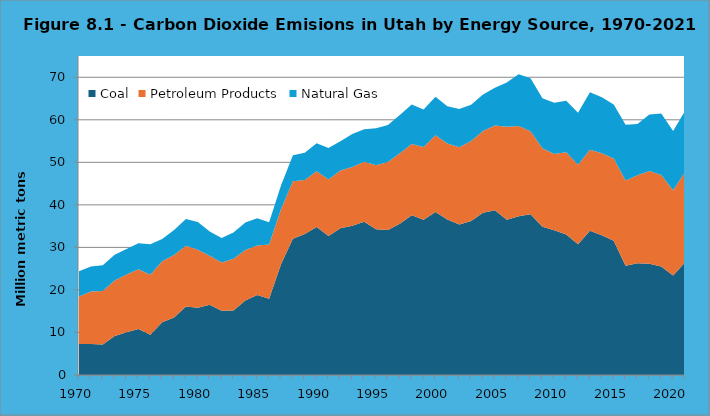
| Category | Coal | Petroleum Products | Natural Gas |
|---|---|---|---|
| 1970.0 | 7.272 | 11.194 | 5.926 |
| 1971.0 | 7.285 | 12.32 | 5.906 |
| 1972.0 | 7.187 | 12.558 | 6.034 |
| 1973.0 | 9.188 | 13.02 | 6.036 |
| 1974.0 | 10.025 | 13.615 | 5.974 |
| 1975.0 | 10.792 | 14.077 | 6.132 |
| 1976.0 | 9.465 | 14.086 | 7.212 |
| 1977.0 | 12.417 | 14.321 | 5.232 |
| 1978.0 | 13.503 | 14.714 | 5.888 |
| 1979.0 | 16.087 | 14.314 | 6.283 |
| 1980.0 | 15.835 | 13.617 | 6.497 |
| 1981.0 | 16.543 | 11.505 | 5.708 |
| 1982.0 | 15.078 | 11.381 | 5.76 |
| 1983.0 | 15.147 | 12.191 | 6.168 |
| 1984.0 | 17.509 | 11.868 | 6.46 |
| 1985.0 | 18.824 | 11.608 | 6.445 |
| 1986.0 | 17.907 | 12.788 | 5.195 |
| 1987.0 | 26.038 | 12.934 | 5.564 |
| 1988.0 | 32.056 | 13.474 | 6.125 |
| 1989.0 | 33.172 | 12.677 | 6.416 |
| 1990.0 | 34.795 | 13.089 | 6.589 |
| 1991.0 | 32.699 | 13.281 | 7.406 |
| 1992.0 | 34.487 | 13.602 | 6.878 |
| 1993.0 | 35.116 | 13.793 | 7.775 |
| 1994.0 | 36.051 | 14.08 | 7.639 |
| 1995.0 | 34.255 | 15.064 | 8.681 |
| 1996.0 | 34.114 | 15.941 | 8.748 |
| 1997.0 | 35.541 | 16.622 | 8.972 |
| 1998.0 | 37.573 | 16.747 | 9.251 |
| 1999.0 | 36.487 | 17.146 | 8.815 |
| 2000.0 | 38.294 | 18.071 | 9.037 |
| 2001.0 | 36.556 | 17.898 | 8.736 |
| 2002.0 | 35.355 | 18.188 | 9.019 |
| 2003.0 | 36.232 | 18.761 | 8.557 |
| 2004.0 | 38.164 | 19.18 | 8.611 |
| 2005.0 | 38.746 | 19.932 | 8.852 |
| 2006.0 | 36.521 | 21.847 | 10.393 |
| 2007.0 | 37.338 | 21.214 | 12.145 |
| 2008.0 | 37.782 | 19.53 | 12.476 |
| 2009.0 | 34.839 | 18.499 | 11.746 |
| 2010.0 | 34.007 | 17.96 | 12.039 |
| 2011.0 | 33.057 | 19.285 | 12.115 |
| 2012.0 | 30.768 | 18.686 | 12.183 |
| 2013.0 | 33.924 | 19.012 | 13.543 |
| 2014.0 | 32.846 | 19.261 | 13.173 |
| 2015.0 | 31.545 | 19.379 | 12.69 |
| 2016.0 | 25.704 | 20.037 | 13.086 |
| 2017.0 | 26.279 | 20.668 | 12.085 |
| 2018.0 | 26.127 | 21.834 | 13.288 |
| 2019.0 | 25.531 | 21.495 | 14.484 |
| 2020.0 | 23.396 | 20.013 | 13.97 |
| 2021.0 | 26.458 | 21.216 | 14.379 |